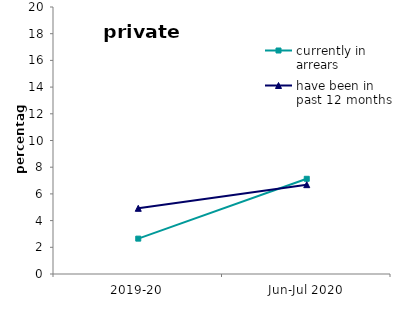
| Category | currently in arrears | have been in past 12 months |
|---|---|---|
| 2019-20 | 2.649 | 4.922 |
| Jun-Jul 2020 | 7.132 | 6.691 |